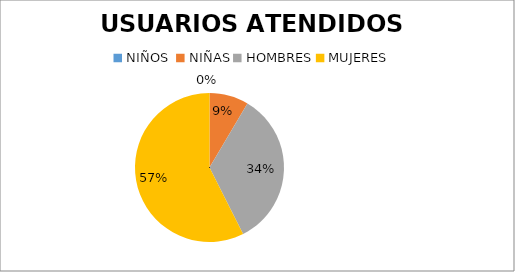
| Category | USUARIOS ATENDIDOS  PORCENTAJE | USUARIOS ATENDIDOS  CANTIDAD |
|---|---|---|
| NIÑOS  | 0 | 0 |
| NIÑAS | 8.511 | 8 |
| HOMBRES | 34.043 | 32 |
| MUJERES | 57.447 | 54 |